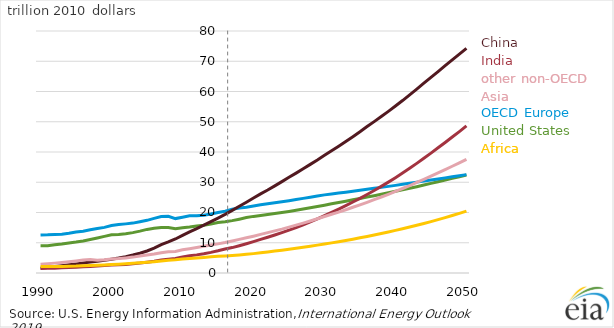
| Category |   United States |  OECD Europe |   China |   India |   Other Asia |  Africa |
|---|---|---|---|---|---|---|
| 1990.0 | 9001.236 | 12549.59 | 1691.767 | 1504.889 | 2863.872 | 2130.583 |
| 1991.0 | 8991.48 | 12619.72 | 1849.102 | 1540.699 | 3057.652 | 2145.646 |
| 1992.0 | 9308.19 | 12756.3 | 2113.215 | 1607.912 | 3264.45 | 2176.214 |
| 1993.0 | 9564.42 | 12792.56 | 2406.461 | 1697.763 | 3480.609 | 2178.307 |
| 1994.0 | 9949.8 | 13113.32 | 2719.652 | 1803.257 | 3724.813 | 2228.764 |
| 1995.0 | 10216.87 | 13521.9 | 3017.827 | 1930.785 | 3988.919 | 2293.924 |
| 1996.0 | 10602.29 | 13833.47 | 3317.244 | 2081.65 | 4260.303 | 2416.523 |
| 1997.0 | 11073.79 | 14301.54 | 3623.644 | 2181.4 | 4431.076 | 2496.554 |
| 1998.0 | 11570.06 | 14705.35 | 3908.87 | 2312.736 | 4223.496 | 2580.903 |
| 1999.0 | 12120.02 | 15087.12 | 4208.537 | 2473.022 | 4384.372 | 2670.101 |
| 2000.0 | 12620.26 | 15718.64 | 4564.631 | 2613.215 | 4646.059 | 2781.3 |
| 2001.0 | 12746.28 | 15996.64 | 4943.789 | 2714.882 | 4759.672 | 2893.601 |
| 2002.0 | 12968.27 | 16241.67 | 5394.461 | 2840.085 | 4987.547 | 3043.798 |
| 2003.0 | 13339.31 | 16490.41 | 5934.918 | 3035.514 | 5253.17 | 3185.169 |
| 2004.0 | 13846.05 | 16956.141 | 6534.216 | 3270.483 | 5601.781 | 3361.873 |
| 2005.0 | 14408.828 | 17407.01 | 7279.111 | 3565.591 | 5946.115 | 3545.521 |
| 2006.0 | 14793.058 | 18057.131 | 8204.07 | 3898.896 | 6306.367 | 3757.517 |
| 2007.0 | 15056.163 | 18658.609 | 9372.664 | 4291.124 | 6721.287 | 3985.486 |
| 2008.0 | 15012.255 | 18754.211 | 10268.7 | 4558.437 | 7020.379 | 4203.882 |
| 2009.0 | 14595.587 | 17989.199 | 11242.36 | 4791.882 | 7135.581 | 4350.122 |
| 2010.0 | 14965.136 | 18444.029 | 12433.81 | 5314.735 | 7658.716 | 4591.234 |
| 2011.0 | 15204.795 | 18898.279 | 13620.1 | 5682.479 | 8020.876 | 4767.483 |
| 2012.0 | 15542.954 | 18916.68 | 14689.15 | 5994.355 | 8436.18 | 4936.344 |
| 2013.0 | 15803.661 | 19101.41 | 15830.47 | 6363.659 | 8826.728 | 5137.997 |
| 2014.0 | 16209.688 | 19512.99 | 16984.461 | 6810.606 | 9230.123 | 5335.894 |
| 2015.0 | 16673.541 | 20015.6 | 18159.25 | 7329.593 | 9627.779 | 5512.915 |
| 2016.0 | 16921.191 | 20437.57 | 19381.141 | 7909.563 | 10063.7 | 5621.571 |
| 2017.0 | 17305.867 | 21052.06 | 20689.49 | 8402.376 | 10577.38 | 5780.527 |
| 2018.0 | 17797.228 | 21500.881 | 22051.711 | 9026.962 | 11116.92 | 5959.246 |
| 2019.0 | 18320.635 | 21764.289 | 23407.051 | 9681.514 | 11629.08 | 6170.1 |
| 2020.0 | 18713.596 | 22153.66 | 24806.35 | 10379.56 | 12173.55 | 6403.866 |
| 2021.0 | 19022.359 | 22532.119 | 26167.199 | 11110.43 | 12765.81 | 6669.605 |
| 2022.0 | 19336.391 | 22889.66 | 27415.74 | 11834.51 | 13355.19 | 6951.84 |
| 2023.0 | 19651.07 | 23208.279 | 28814.211 | 12567.3 | 13915.43 | 7247.509 |
| 2024.0 | 19992.029 | 23548.051 | 30212.449 | 13332.48 | 14507.36 | 7554.09 |
| 2025.0 | 20362.652 | 23913.48 | 31631.48 | 14146.71 | 15161.04 | 7872.578 |
| 2026.0 | 20746.51 | 24290.57 | 33008.871 | 15020.57 | 15833.29 | 8194.148 |
| 2027.0 | 21149.549 | 24674.381 | 34455.391 | 15950 | 16505.631 | 8523.639 |
| 2028.0 | 21576.037 | 25048.15 | 35913.539 | 16911.83 | 17206.07 | 8863.154 |
| 2029.0 | 21992.422 | 25434.891 | 37366.57 | 17915.211 | 17941.359 | 9215.111 |
| 2030.0 | 22428.514 | 25822.52 | 38893.25 | 18959.81 | 18678.6 | 9582.058 |
| 2031.0 | 22868.67 | 26136.369 | 40403.461 | 20027.15 | 19407.48 | 9958.297 |
| 2032.0 | 23296.367 | 26414.75 | 41932.121 | 21128.029 | 20145.67 | 10345.8 |
| 2033.0 | 23746.863 | 26705.039 | 43486.52 | 22271.609 | 20923.17 | 10754.52 |
| 2034.0 | 24202.787 | 27015.551 | 45072.98 | 23459.99 | 21723.19 | 11181.75 |
| 2035.0 | 24646.531 | 27341.18 | 46695.859 | 24692.93 | 22539.18 | 11626.03 |
| 2036.0 | 25093.955 | 27663.119 | 48400.629 | 25962.6 | 23366.02 | 12083.13 |
| 2037.0 | 25554.98 | 27987.98 | 50043.102 | 27277.961 | 24235.949 | 12560.17 |
| 2038.0 | 26028.576 | 28308.31 | 51732.68 | 28634.471 | 25116.02 | 13052.11 |
| 2039.0 | 26509.66 | 28632.83 | 53436.23 | 30040.77 | 26022.91 | 13561.72 |
| 2040.0 | 27001.959 | 28968.82 | 55218.809 | 31498.221 | 26970.551 | 14093.38 |
| 2041.0 | 27495.559 | 29326.539 | 57003.801 | 33028.43 | 27933.279 | 14632.11 |
| 2042.0 | 28010.522 | 29692.02 | 58910.43 | 34611.328 | 28920.74 | 15194.24 |
| 2043.0 | 28537.299 | 30038.891 | 60799.52 | 36235.66 | 29935 | 15774.52 |
| 2044.0 | 29069.938 | 30388.85 | 62765.922 | 37921.102 | 30981.211 | 16372.25 |
| 2045.0 | 29620.272 | 30747.31 | 64680.211 | 39639.16 | 32060 | 16996.789 |
| 2046.0 | 30166.158 | 31102.44 | 66599.203 | 41382.93 | 33125.691 | 17636.131 |
| 2047.0 | 30732.951 | 31447.5 | 68550.812 | 43149 | 34198.922 | 18300.58 |
| 2048.0 | 31289.068 | 31797.859 | 70468.711 | 44938.699 | 35292.691 | 18992.641 |
| 2049.0 | 31846.09 | 32148.83 | 72356.648 | 46747.371 | 36407.461 | 19709.461 |
| 2050.0 | 32398.947 | 32523.199 | 74263.867 | 48634.141 | 37565.41 | 20458.539 |